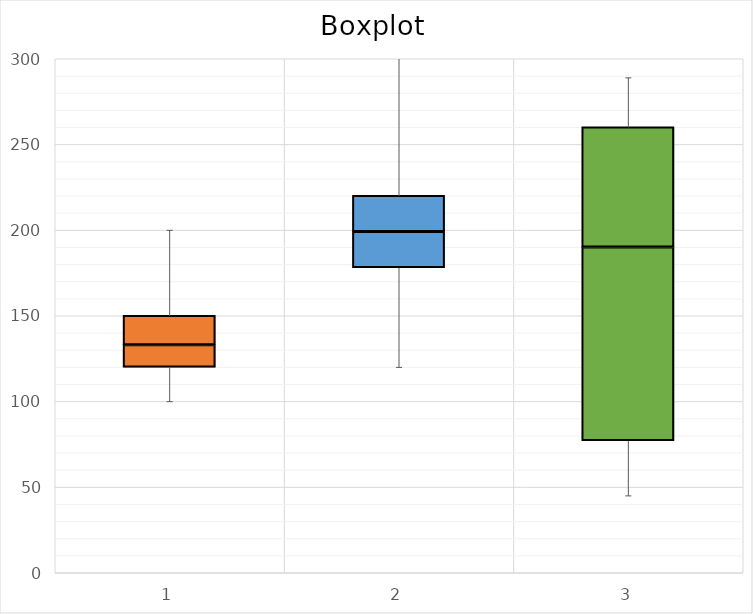
| Category | q1 | z-q1 | q3-z |
|---|---|---|---|
| 0 | 120 | 13 | 17 |
| 1 | 178 | 21 | 21 |
| 2 | 77 | 113 | 70 |